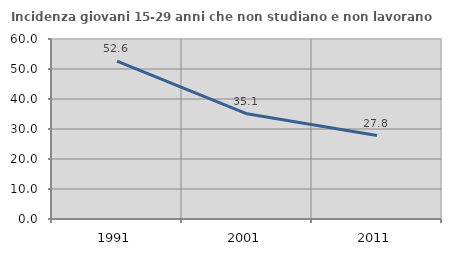
| Category | Incidenza giovani 15-29 anni che non studiano e non lavorano  |
|---|---|
| 1991.0 | 52.59 |
| 2001.0 | 35.053 |
| 2011.0 | 27.811 |